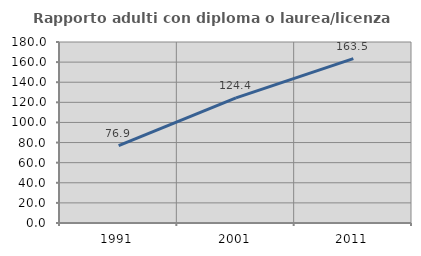
| Category | Rapporto adulti con diploma o laurea/licenza media  |
|---|---|
| 1991.0 | 76.887 |
| 2001.0 | 124.37 |
| 2011.0 | 163.478 |